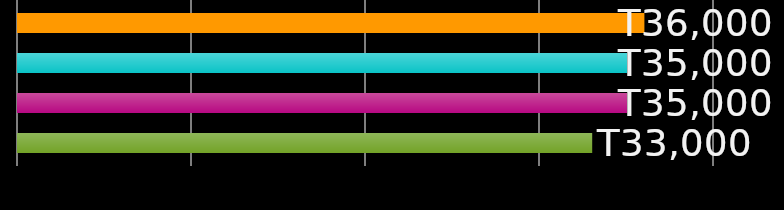
| Category | бірге тұратын адам 1 | бірге тұратын адам 2 | бірге тұратын адам 3 | бірге тұратын адам 4 |
|---|---|---|---|---|
| 0 | 36000 | 35000 | 35000 | 33000 |